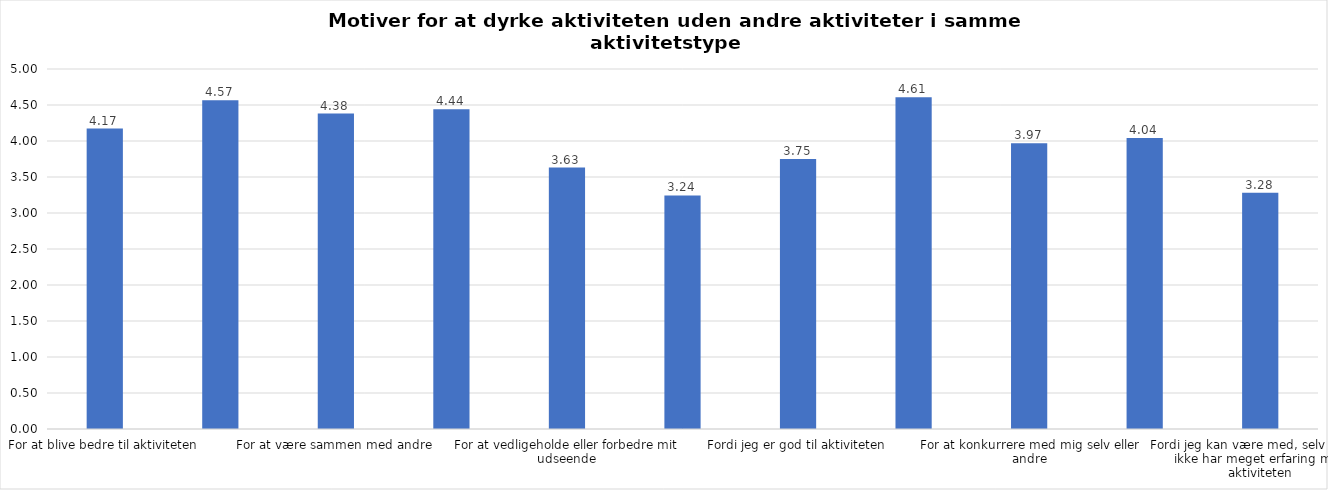
| Category | Gennemsnit |
|---|---|
| For at blive bedre til aktiviteten | 4.173 |
| For at vedligeholde eller forbedre min sundhed (fx helbred, fysisk form) | 4.565 |
| For at være sammen med andre | 4.381 |
| For at gøre noget godt for mig selv | 4.44 |
| For at vedligeholde eller forbedre mit udseende | 3.631 |
| Fordi andre i min omgangskreds opmuntrer mig til det | 3.244 |
| Fordi jeg er god til aktiviteten | 3.75 |
| Fordi jeg godt kan lide aktiviteten | 4.607 |
| For at konkurrere med mig selv eller andre | 3.97 |
| Fordi aktiviteten passer godt ind i min hverdag | 4.042 |
| Fordi jeg kan være med, selv om jeg ikke har meget erfaring med aktiviteten | 3.28 |